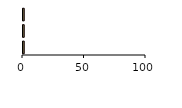
| Category | ACS | Iluminación | Calefacción |
|---|---|---|---|
| 0 | 1 | 1 | 1 |